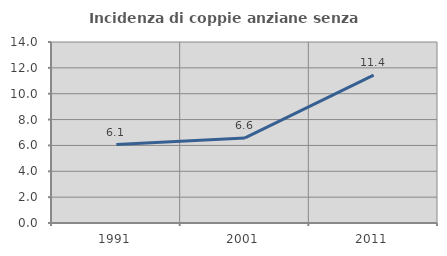
| Category | Incidenza di coppie anziane senza figli  |
|---|---|
| 1991.0 | 6.068 |
| 2001.0 | 6.579 |
| 2011.0 | 11.432 |